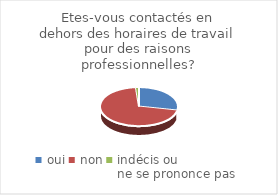
| Category | Etes-vous contactés en dehors des horaires de travail pour des raisons professionnelles? |
|---|---|
| oui | 22 |
| non | 55 |
| indécis ou 
ne se prononce pas | 1 |